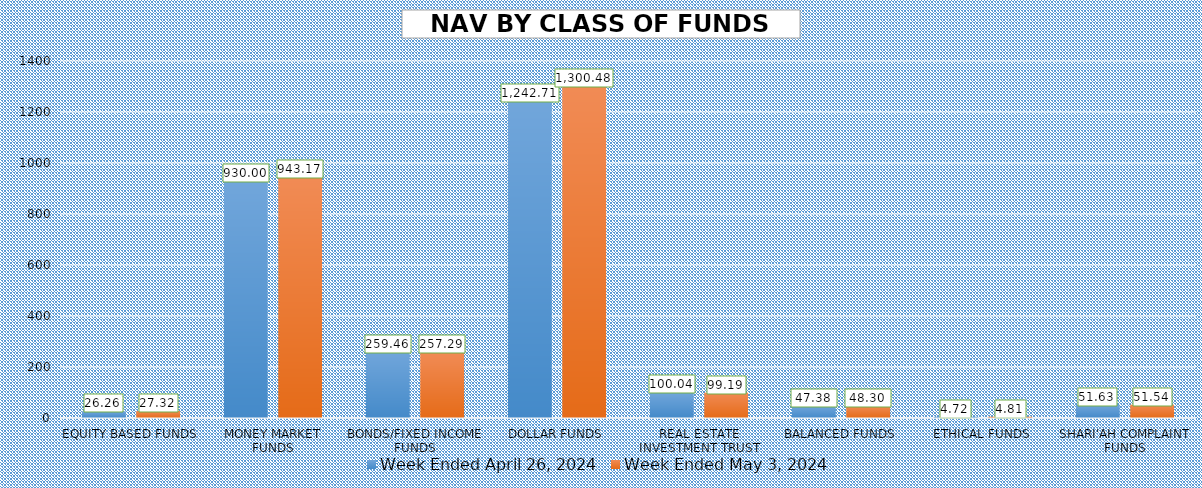
| Category | Week Ended April 26, 2024 | Week Ended May 3, 2024 |
|---|---|---|
| EQUITY BASED FUNDS | 26.264 | 27.319 |
| MONEY MARKET FUNDS | 929.998 | 943.173 |
| BONDS/FIXED INCOME FUNDS | 259.456 | 257.292 |
| DOLLAR FUNDS | 1242.708 | 1300.481 |
| REAL ESTATE INVESTMENT TRUST | 100.038 | 99.185 |
| BALANCED FUNDS | 47.382 | 48.299 |
| ETHICAL FUNDS | 4.723 | 4.808 |
| SHARI'AH COMPLAINT FUNDS | 51.626 | 51.539 |